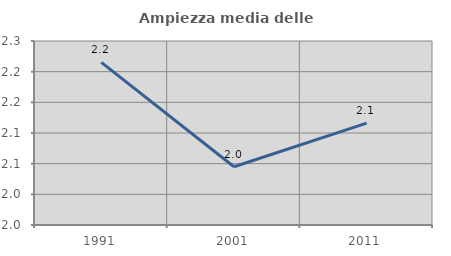
| Category | Ampiezza media delle famiglie |
|---|---|
| 1991.0 | 2.215 |
| 2001.0 | 2.045 |
| 2011.0 | 2.116 |